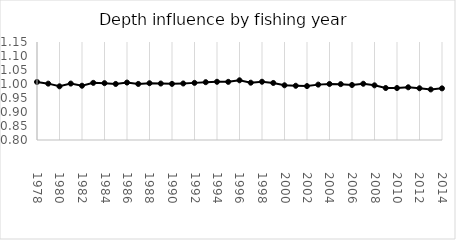
| Category | Series 0 |
|---|---|
| 1978.0 | 1.007 |
| 1979.0 | 1.001 |
| 1980.0 | 0.992 |
| 1981.0 | 1.002 |
| 1982.0 | 0.994 |
| 1983.0 | 1.004 |
| 1984.0 | 1.003 |
| 1985.0 | 1 |
| 1986.0 | 1.005 |
| 1987.0 | 1 |
| 1988.0 | 1.003 |
| 1989.0 | 1.002 |
| 1990.0 | 1 |
| 1991.0 | 1.002 |
| 1992.0 | 1.004 |
| 1993.0 | 1.006 |
| 1994.0 | 1.008 |
| 1995.0 | 1.008 |
| 1996.0 | 1.013 |
| 1997.0 | 1.005 |
| 1998.0 | 1.008 |
| 1999.0 | 1.004 |
| 2000.0 | 0.995 |
| 2001.0 | 0.994 |
| 2002.0 | 0.993 |
| 2003.0 | 0.998 |
| 2004.0 | 1 |
| 2005.0 | 0.999 |
| 2006.0 | 0.996 |
| 2007.0 | 1.001 |
| 2008.0 | 0.995 |
| 2009.0 | 0.986 |
| 2010.0 | 0.986 |
| 2011.0 | 0.988 |
| 2012.0 | 0.985 |
| 2013.0 | 0.981 |
| 2014.0 | 0.984 |